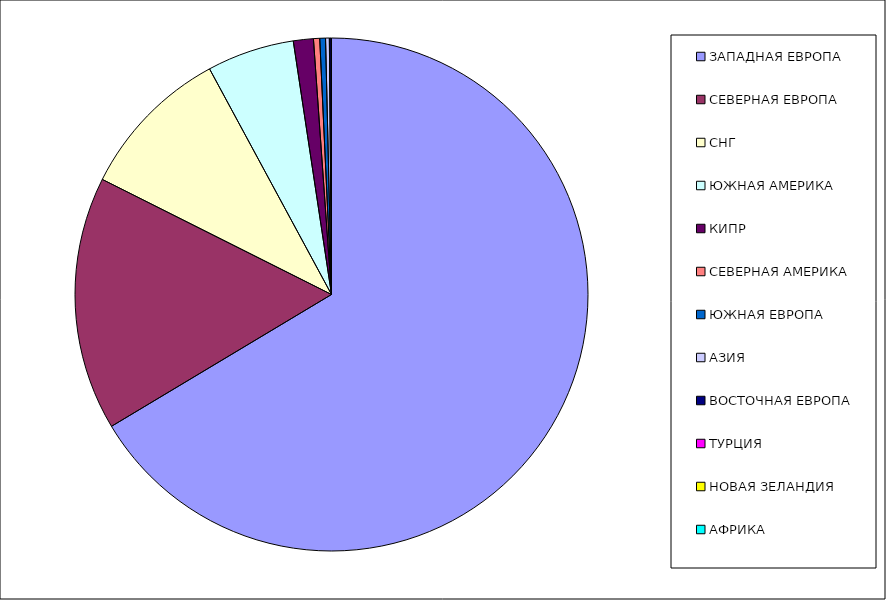
| Category | Оборот |
|---|---|
| ЗАПАДНАЯ ЕВРОПА | 0.664 |
| СЕВЕРНАЯ ЕВРОПА | 0.16 |
| СНГ | 0.097 |
| ЮЖНАЯ АМЕРИКА | 0.055 |
| КИПР | 0.013 |
| СЕВЕРНАЯ АМЕРИКА | 0.004 |
| ЮЖНАЯ ЕВРОПА | 0.004 |
| АЗИЯ | 0.002 |
| ВОСТОЧНАЯ ЕВРОПА | 0.001 |
| ТУРЦИЯ | 0 |
| НОВАЯ ЗЕЛАНДИЯ | 0 |
| АФРИКА | 0 |